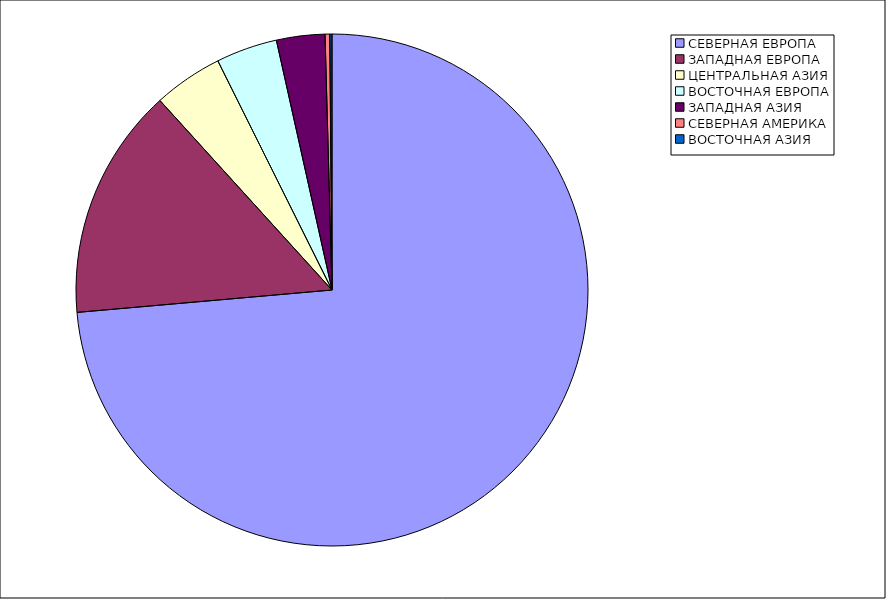
| Category | Оборот |
|---|---|
| СЕВЕРНАЯ ЕВРОПА | 73.602 |
| ЗАПАДНАЯ ЕВРОПА | 14.662 |
| ЦЕНТРАЛЬНАЯ АЗИЯ | 4.377 |
| ВОСТОЧНАЯ ЕВРОПА | 3.868 |
| ЗАПАДНАЯ АЗИЯ | 3.055 |
| СЕВЕРНАЯ АМЕРИКА | 0.294 |
| ВОСТОЧНАЯ АЗИЯ | 0.139 |